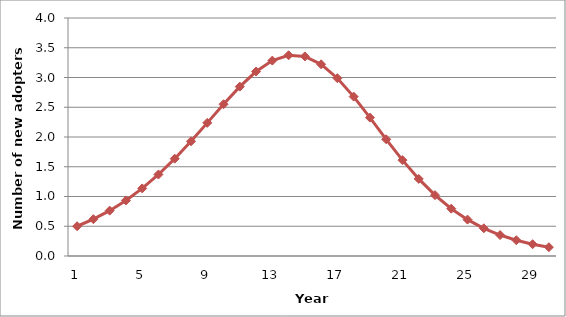
| Category | Series 0 |
|---|---|
| 0 | 0.5 |
| 1 | 0.619 |
| 2 | 0.762 |
| 3 | 0.934 |
| 4 | 1.136 |
| 5 | 1.37 |
| 6 | 1.635 |
| 7 | 1.928 |
| 8 | 2.237 |
| 9 | 2.551 |
| 10 | 2.847 |
| 11 | 3.1 |
| 12 | 3.284 |
| 13 | 3.374 |
| 14 | 3.354 |
| 15 | 3.221 |
| 16 | 2.988 |
| 17 | 2.679 |
| 18 | 2.326 |
| 19 | 1.961 |
| 20 | 1.612 |
| 21 | 1.295 |
| 22 | 1.023 |
| 23 | 0.795 |
| 24 | 0.611 |
| 25 | 0.466 |
| 26 | 0.352 |
| 27 | 0.265 |
| 28 | 0.198 |
| 29 | 0.148 |